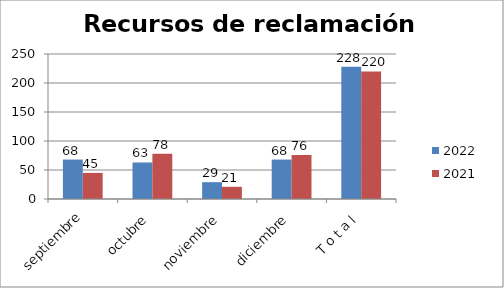
| Category | 2022 | 2021 |
|---|---|---|
| septiembre | 68 | 45 |
| octubre | 63 | 78 |
| noviembre | 29 | 21 |
| diciembre | 68 | 76 |
| T o t a l | 228 | 220 |